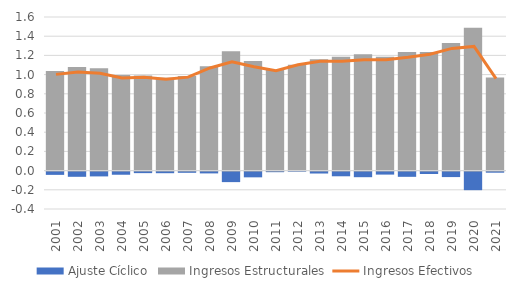
| Category | Ajuste Cíclico | Ingresos Estructurales |
|---|---|---|
| 2001.0 | -0.034 | 1.036 |
| 2002.0 | -0.054 | 1.08 |
| 2003.0 | -0.05 | 1.065 |
| 2004.0 | -0.033 | 0.997 |
| 2005.0 | -0.016 | 0.989 |
| 2006.0 | -0.017 | 0.968 |
| 2007.0 | -0.013 | 0.986 |
| 2008.0 | -0.019 | 1.088 |
| 2009.0 | -0.11 | 1.244 |
| 2010.0 | -0.06 | 1.141 |
| 2011.0 | -0.006 | 1.047 |
| 2012.0 | 0.003 | 1.1 |
| 2013.0 | -0.02 | 1.159 |
| 2014.0 | -0.049 | 1.187 |
| 2015.0 | -0.058 | 1.212 |
| 2016.0 | -0.031 | 1.186 |
| 2017.0 | -0.054 | 1.235 |
| 2018.0 | -0.025 | 1.237 |
| 2019.0 | -0.057 | 1.33 |
| 2020.0 | -0.193 | 1.487 |
| 2021.0 | -0.011 | 0.969 |